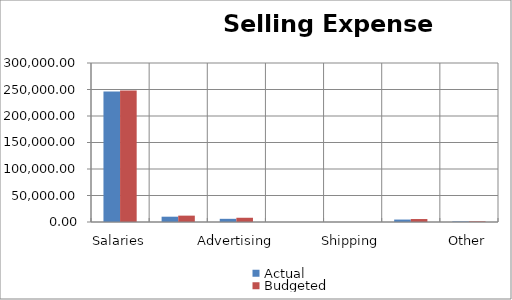
| Category | Actual | Budgeted |
|---|---|---|
| Salaries | 246000 | 248000 |
| Commissions | 10000 | 12000 |
| Advertising | 6000 | 8000 |
| Delivery | 0 | 0 |
| Shipping | 0 | 0 |
| Travel | 4600 | 5600 |
| Other | 1000 | 1200 |